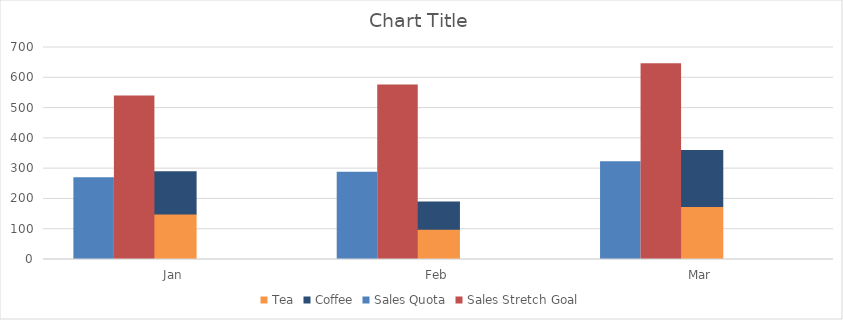
| Category | Tea | Coffee |
|---|---|---|
| Jan | 150 | 140 |
| Feb | 100 | 90 |
| Mar | 175 | 185 |